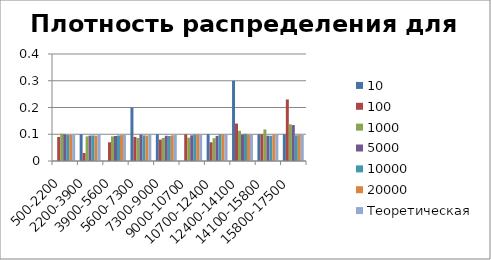
| Category | 10 | 100 | 1000 | 5000 | 10000 | 20000 | Теоретическая |
|---|---|---|---|---|---|---|---|
| 500-2200 | 0 | 0.09 | 0.102 | 0.1 | 0.097 | 0.097 | 0.1 |
| 2200-3900 | 0.1 | 0.03 | 0.092 | 0.095 | 0.096 | 0.095 | 0.1 |
| 3900-5600 | 0 | 0.07 | 0.092 | 0.093 | 0.096 | 0.097 | 0.1 |
| 5600-7300 | 0.2 | 0.09 | 0.086 | 0.099 | 0.096 | 0.095 | 0.1 |
| 7300-9000 | 0.1 | 0.08 | 0.086 | 0.094 | 0.093 | 0.096 | 0.1 |
| 9000-10700 | 0 | 0.1 | 0.087 | 0.096 | 0.099 | 0.099 | 0.1 |
| 10700-12400 | 0.1 | 0.07 | 0.085 | 0.094 | 0.099 | 0.1 | 0.1 |
| 12400-14100 | 0.3 | 0.14 | 0.113 | 0.099 | 0.102 | 0.098 | 0.1 |
| 14100-15800 | 0.1 | 0.1 | 0.118 | 0.095 | 0.094 | 0.098 | 0.1 |
| 15800-17500 | 0.1 | 0.23 | 0.137 | 0.134 | 0.096 | 0.098 | 0.1 |